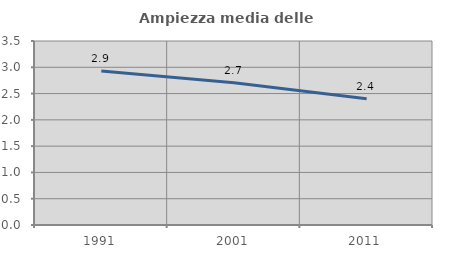
| Category | Ampiezza media delle famiglie |
|---|---|
| 1991.0 | 2.931 |
| 2001.0 | 2.705 |
| 2011.0 | 2.4 |